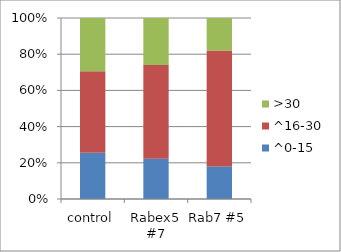
| Category | ^0-15 | ^16-30 | >30 |
|---|---|---|---|
| control | 25.49 | 45.098 | 29.412 |
| Rabex5 #7 | 22.222 | 51.852 | 25.926 |
| Rab7 #5 | 18 | 64 | 18 |